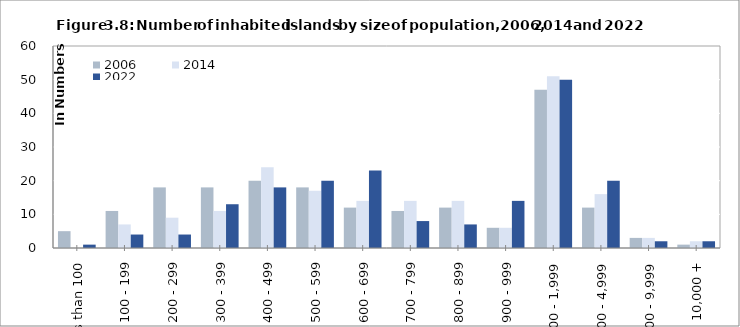
| Category | 2006  | 2014  | 2022  |
|---|---|---|---|
| Less than 100 | 5 | 0 | 1 |
| 100 - 199 | 11 | 7 | 4 |
| 200 - 299 | 18 | 9 | 4 |
| 300 - 399 | 18 | 11 | 13 |
| 400 - 499 | 20 | 24 | 18 |
| 500 - 599 | 18 | 17 | 20 |
| 600 - 699 | 12 | 14 | 23 |
| 700 - 799 | 11 | 14 | 8 |
| 800 - 899 | 12 | 14 | 7 |
| 900 - 999 | 6 | 6 | 14 |
| 1,000 - 1,999 | 47 | 51 | 50 |
| 2,000 - 4,999 | 12 | 16 | 20 |
| 5,000 - 9,999 | 3 | 3 | 2 |
| 10,000 + | 1 | 2 | 2 |